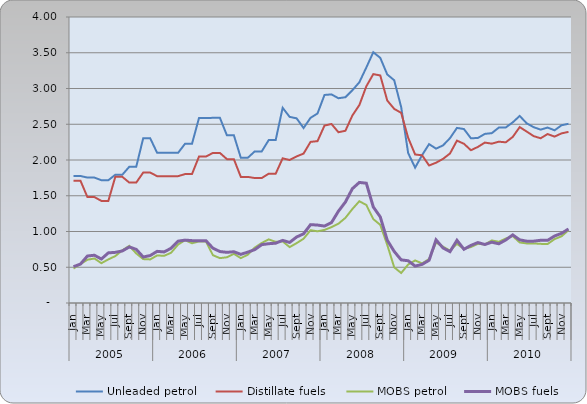
| Category | Unleaded petrol | Distillate fuels | MOBS petrol | MOBS fuels |
|---|---|---|---|---|
| 0 | 1.776 | 1.71 | 0.482 | 0.508 |
| 1 | 1.776 | 1.71 | 0.544 | 0.545 |
| 2 | 1.754 | 1.482 | 0.605 | 0.657 |
| 3 | 1.754 | 1.482 | 0.623 | 0.668 |
| 4 | 1.717 | 1.428 | 0.557 | 0.615 |
| 5 | 1.717 | 1.428 | 0.61 | 0.701 |
| 6 | 1.794 | 1.765 | 0.656 | 0.708 |
| 7 | 1.794 | 1.765 | 0.737 | 0.728 |
| 8 | 1.905 | 1.684 | 0.799 | 0.783 |
| 9 | 1.905 | 1.684 | 0.694 | 0.751 |
| 10 | 2.305 | 1.824 | 0.614 | 0.643 |
| 11 | 2.305 | 1.824 | 0.61 | 0.664 |
| 12 | 2.1 | 1.774 | 0.665 | 0.722 |
| 13 | 2.1 | 1.774 | 0.66 | 0.714 |
| 14 | 2.1 | 1.774 | 0.703 | 0.766 |
| 15 | 2.1 | 1.774 | 0.817 | 0.865 |
| 16 | 2.227 | 1.803 | 0.879 | 0.88 |
| 17 | 2.227 | 1.803 | 0.835 | 0.872 |
| 18 | 2.587 | 2.048 | 0.862 | 0.871 |
| 19 | 2.587 | 2.048 | 0.862 | 0.871 |
| 20 | 2.59 | 2.099 | 0.668 | 0.767 |
| 21 | 2.59 | 2.099 | 0.628 | 0.72 |
| 22 | 2.346 | 2.012 | 0.639 | 0.709 |
| 23 | 2.346 | 2.012 | 0.688 | 0.717 |
| 24 | 2.031 | 1.764 | 0.627 | 0.68 |
| 25 | 2.031 | 1.764 | 0.676 | 0.712 |
| 26 | 2.121 | 1.748 | 0.775 | 0.747 |
| 27 | 2.121 | 1.748 | 0.84 | 0.816 |
| 28 | 2.278 | 1.808 | 0.89 | 0.829 |
| 29 | 2.278 | 1.808 | 0.855 | 0.836 |
| 30 | 2.73 | 2.023 | 0.862 | 0.876 |
| 31 | 2.603 | 2 | 0.782 | 0.847 |
| 32 | 2.583 | 2.05 | 0.837 | 0.923 |
| 33 | 2.447 | 2.09 | 0.899 | 0.968 |
| 34 | 2.59 | 2.253 | 1.018 | 1.096 |
| 35 | 2.651 | 2.264 | 1.003 | 1.09 |
| 36 | 2.91 | 2.481 | 1.022 | 1.076 |
| 37 | 2.918 | 2.504 | 1.061 | 1.124 |
| 38 | 2.864 | 2.388 | 1.109 | 1.284 |
| 39 | 2.878 | 2.409 | 1.191 | 1.412 |
| 40 | 2.975 | 2.622 | 1.314 | 1.599 |
| 41 | 3.087 | 2.768 | 1.423 | 1.686 |
| 42 | 3.293 | 3.03 | 1.371 | 1.675 |
| 43 | 3.507 | 3.201 | 1.174 | 1.343 |
| 44 | 3.428 | 3.183 | 1.092 | 1.204 |
| 45 | 3.197 | 2.832 | 0.814 | 0.879 |
| 46 | 3.115 | 2.715 | 0.499 | 0.721 |
| 47 | 2.739 | 2.659 | 0.42 | 0.603 |
| 48 | 2.097 | 2.311 | 0.538 | 0.591 |
| 49 | 1.893 | 2.077 | 0.595 | 0.516 |
| 50 | 2.068 | 2.066 | 0.554 | 0.54 |
| 51 | 2.222 | 1.924 | 0.615 | 0.597 |
| 52 | 2.159 | 1.962 | 0.846 | 0.883 |
| 53 | 2.204 | 2.016 | 0.788 | 0.77 |
| 54 | 2.306 | 2.091 | 0.733 | 0.718 |
| 55 | 2.449 | 2.271 | 0.827 | 0.877 |
| 56 | 2.433 | 2.227 | 0.757 | 0.751 |
| 57 | 2.304 | 2.137 | 0.782 | 0.805 |
| 58 | 2.308 | 2.183 | 0.828 | 0.845 |
| 59 | 2.365 | 2.244 | 0.819 | 0.818 |
| 60 | 2.376 | 2.228 | 0.875 | 0.85 |
| 61 | 2.453 | 2.256 | 0.856 | 0.828 |
| 62 | 2.455 | 2.247 | 0.902 | 0.882 |
| 63 | 2.526 | 2.323 | 0.936 | 0.953 |
| 64 | 2.616 | 2.46 | 0.846 | 0.883 |
| 65 | 2.513 | 2.398 | 0.833 | 0.865 |
| 66 | 2.459 | 2.334 | 0.833 | 0.865 |
| 67 | 2.425 | 2.304 | 0.827 | 0.877 |
| 68 | 2.454 | 2.363 | 0.825 | 0.876 |
| 69 | 2.415 | 2.327 | 0.894 | 0.937 |
| 70 | 2.486 | 2.372 | 0.933 | 0.974 |
| 71 | 2.507 | 2.393 | 1.018 | 1.036 |